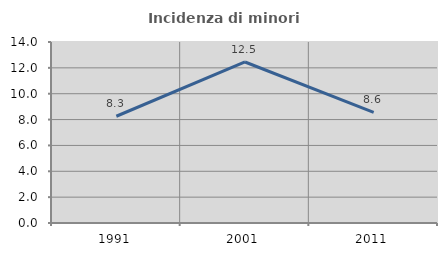
| Category | Incidenza di minori stranieri |
|---|---|
| 1991.0 | 8.257 |
| 2001.0 | 12.454 |
| 2011.0 | 8.559 |